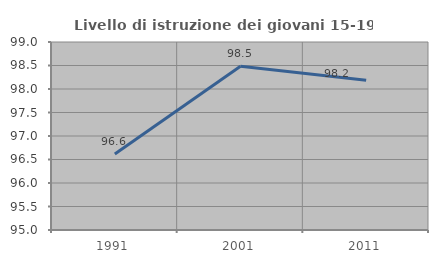
| Category | Livello di istruzione dei giovani 15-19 anni |
|---|---|
| 1991.0 | 96.619 |
| 2001.0 | 98.485 |
| 2011.0 | 98.187 |